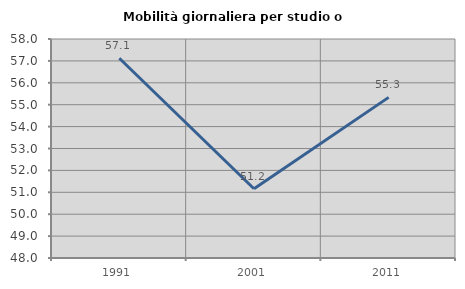
| Category | Mobilità giornaliera per studio o lavoro |
|---|---|
| 1991.0 | 57.12 |
| 2001.0 | 51.161 |
| 2011.0 | 55.335 |